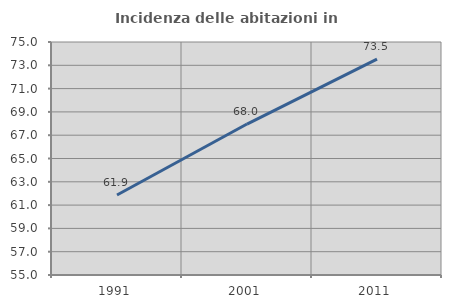
| Category | Incidenza delle abitazioni in proprietà  |
|---|---|
| 1991.0 | 61.866 |
| 2001.0 | 67.957 |
| 2011.0 | 73.529 |